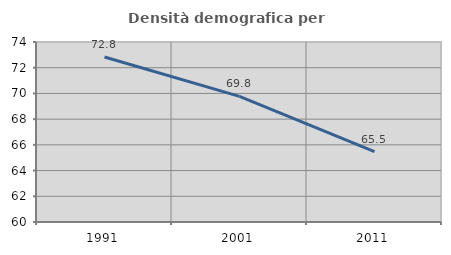
| Category | Densità demografica |
|---|---|
| 1991.0 | 72.828 |
| 2001.0 | 69.775 |
| 2011.0 | 65.478 |